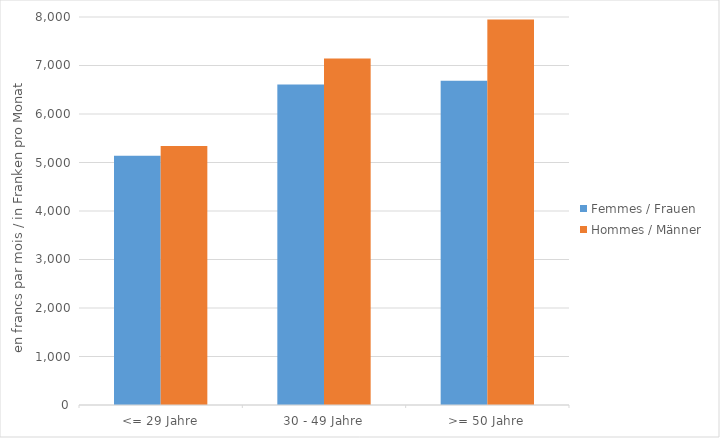
| Category | Femmes / Frauen | Hommes / Männer |
|---|---|---|
| <= 29 Jahre | 5140 | 5340 |
| 30 - 49 Jahre | 6606 | 7143 |
| >= 50 Jahre | 6687 | 7949 |